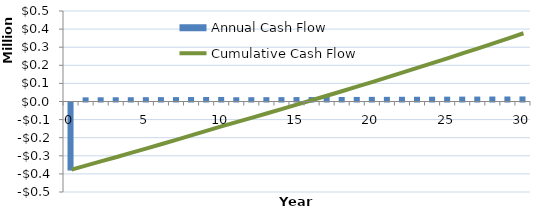
| Category | Annual Cash Flow |
|---|---|
| 0.0 | -376000 |
| 1.0 | 22987.532 |
| 2.0 | 23210.243 |
| 3.0 | 23435.391 |
| 4.0 | 23662.695 |
| 5.0 | 23892.176 |
| 6.0 | 24123.853 |
| 7.0 | 24357.749 |
| 8.0 | 24593.882 |
| 9.0 | 24832.275 |
| 10.0 | 25072.949 |
| 11.0 | 23466.264 |
| 12.0 | 23683.818 |
| 13.0 | 23903.301 |
| 14.0 | 24124.728 |
| 15.0 | 24348.117 |
| 16.0 | 24573.481 |
| 17.0 | 24800.838 |
| 18.0 | 25030.203 |
| 19.0 | 25261.594 |
| 20.0 | 25495.025 |
| 21.0 | 25730.513 |
| 22.0 | 25968.076 |
| 23.0 | 26207.729 |
| 24.0 | 26449.49 |
| 25.0 | 26693.374 |
| 26.0 | 26939.4 |
| 27.0 | 27187.584 |
| 28.0 | 27437.944 |
| 29.0 | 27690.496 |
| 30.0 | 27945.258 |